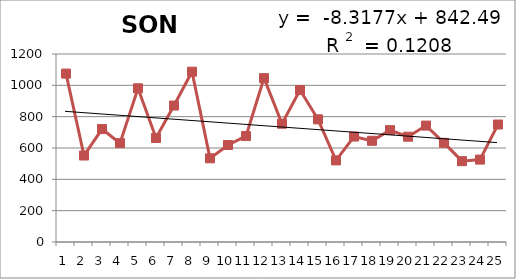
| Category | 1988-2012 |
|---|---|
| 0 | 1075 |
| 1 | 552 |
| 2 | 721 |
| 3 | 631 |
| 4 | 981 |
| 5 | 664 |
| 6 | 871 |
| 7 | 1087 |
| 8 | 534 |
| 9 | 619 |
| 10 | 676 |
| 11 | 1046 |
| 12 | 755 |
| 13 | 970 |
| 14 | 783 |
| 15 | 521 |
| 16 | 673 |
| 17 | 646 |
| 18 | 714 |
| 19 | 672 |
| 20 | 743 |
| 21 | 633 |
| 22 | 516 |
| 23 | 526 |
| 24 | 750 |